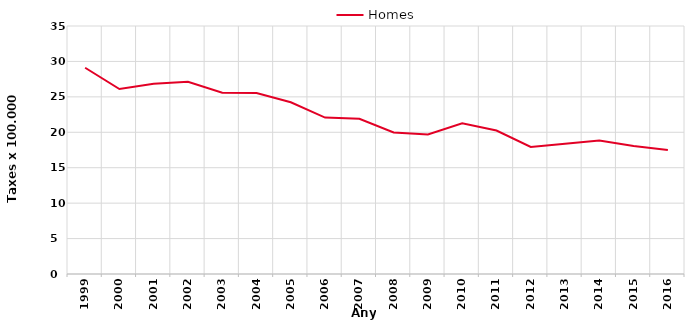
| Category | Homes |
|---|---|
| 1999.0 | 29.11 |
| 2000.0 | 26.1 |
| 2001.0 | 26.85 |
| 2002.0 | 27.12 |
| 2003.0 | 25.58 |
| 2004.0 | 25.54 |
| 2005.0 | 24.23 |
| 2006.0 | 22.08 |
| 2007.0 | 21.91 |
| 2008.0 | 19.97 |
| 2009.0 | 19.69 |
| 2010.0 | 21.28 |
| 2011.0 | 20.25 |
| 2012.0 | 17.93 |
| 2013.0 | 18.38 |
| 2014.0 | 18.83 |
| 2015.0 | 18.08 |
| 2016.0 | 17.49 |